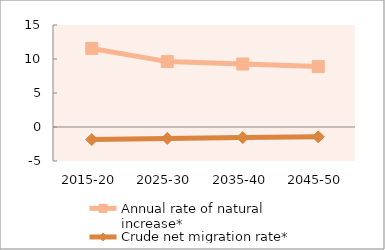
| Category | Annual rate of natural increase* | Crude net migration rate* |
|---|---|---|
| 2015-20 | 11.552 | -1.841 |
| 2025-30 | 9.619 | -1.686 |
| 2035-40 | 9.26 | -1.561 |
| 2045-50 | 8.884 | -1.446 |